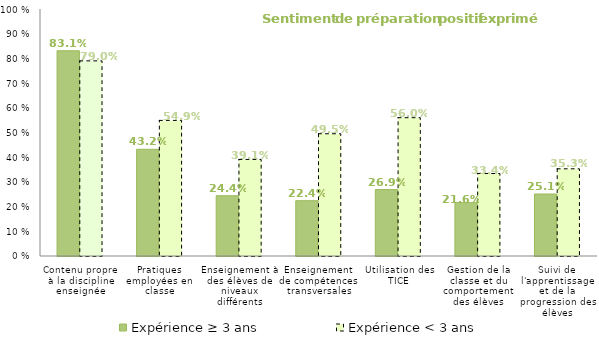
| Category | Expérience ≥ 3 ans | Expérience < 3 ans |
|---|---|---|
| Contenu propre à la discipline enseignée | 0.831 | 0.79 |
| Pratiques employées en classe | 0.432 | 0.549 |
| Enseignement à des élèves de niveaux différents | 0.244 | 0.391 |
| Enseignement de compétences transversales | 0.224 | 0.495 |
| Utilisation des TICE | 0.269 | 0.56 |
| Gestion de la classe et du comportement des élèves | 0.216 | 0.334 |
| Suivi de l'apprentissage et de la progression des élèves | 0.251 | 0.353 |